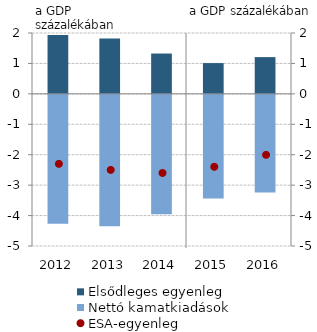
| Category | Elsődleges egyenleg |
|---|---|
| 2012.0 | 1.938 |
| 2013.0 | 1.821 |
| 2014.0 | 1.325 |
| 2015.0 | 1.011 |
| 2016.0 | 1.208 |